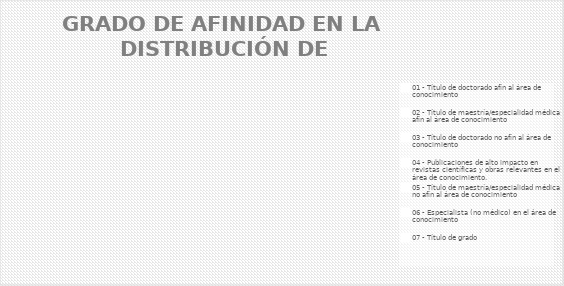
| Category | Series 0 |
|---|---|
| 01 - Título de doctorado afín al área de conocimiento  | 0 |
| 02 - Título de maestría/especialidad médica afín al área de conocimiento  | 0 |
| 03 - Título de doctorado no afín al área de conocimiento | 0 |
| 04 - Publicaciones de alto impacto en revistas científicas y obras relevantes en el área de conocimiento. | 0 |
| 05 - Título de maestría/especialidad médica no afín al área de conocimiento | 0 |
| 06 - Especialista (no médico) en el área de conocimiento | 0 |
| 07 - Título de grado | 0 |